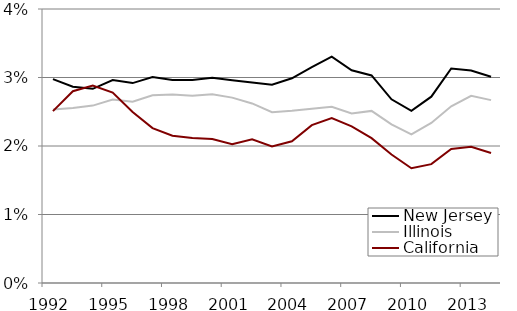
| Category | New Jersey | Illinois | California |
|---|---|---|---|
| 1992.0 | 0.03 | 0.025 | 0.025 |
| 1993.0 | 0.029 | 0.026 | 0.028 |
| 1994.0 | 0.028 | 0.026 | 0.029 |
| 1995.0 | 0.03 | 0.027 | 0.028 |
| 1996.0 | 0.029 | 0.026 | 0.025 |
| 1997.0 | 0.03 | 0.027 | 0.023 |
| 1998.0 | 0.03 | 0.028 | 0.022 |
| 1999.0 | 0.03 | 0.027 | 0.021 |
| 2000.0 | 0.03 | 0.028 | 0.021 |
| 2001.0 | 0.03 | 0.027 | 0.02 |
| 2002.0 | 0.029 | 0.026 | 0.021 |
| 2003.0 | 0.029 | 0.025 | 0.02 |
| 2004.0 | 0.03 | 0.025 | 0.021 |
| 2005.0 | 0.032 | 0.025 | 0.023 |
| 2006.0 | 0.033 | 0.026 | 0.024 |
| 2007.0 | 0.031 | 0.025 | 0.023 |
| 2008.0 | 0.03 | 0.025 | 0.021 |
| 2009.0 | 0.027 | 0.023 | 0.019 |
| 2010.0 | 0.025 | 0.022 | 0.017 |
| 2011.0 | 0.027 | 0.023 | 0.017 |
| 2012.0 | 0.031 | 0.026 | 0.02 |
| 2013.0 | 0.031 | 0.027 | 0.02 |
| 2014.0 | 0.03 | 0.027 | 0.019 |